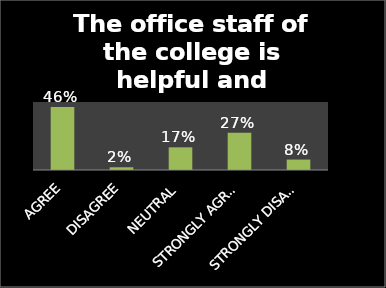
| Category | Series 0 |
|---|---|
| AGREE | 0.463 |
| DISAGREE | 0.02 |
| NEUTRAL | 0.167 |
| STRONGLY AGREE | 0.273 |
| STRONGLY DISAGREE | 0.077 |